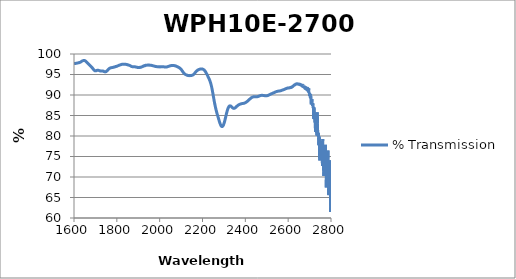
| Category | % Transmission |
|---|---|
| 1600.0 | 97.657 |
| 1601.0 | 97.665 |
| 1602.0 | 97.665 |
| 1603.0 | 97.666 |
| 1604.0 | 97.664 |
| 1605.0 | 97.682 |
| 1606.0 | 97.692 |
| 1607.0 | 97.693 |
| 1608.0 | 97.714 |
| 1609.0 | 97.718 |
| 1610.0 | 97.729 |
| 1611.0 | 97.745 |
| 1612.0 | 97.748 |
| 1613.0 | 97.765 |
| 1614.0 | 97.775 |
| 1615.0 | 97.781 |
| 1616.0 | 97.804 |
| 1617.0 | 97.8 |
| 1618.0 | 97.821 |
| 1619.0 | 97.83 |
| 1620.0 | 97.844 |
| 1621.0 | 97.852 |
| 1622.0 | 97.857 |
| 1623.0 | 97.887 |
| 1624.0 | 97.904 |
| 1625.0 | 97.9 |
| 1626.0 | 97.936 |
| 1627.0 | 97.942 |
| 1628.0 | 97.966 |
| 1629.0 | 97.985 |
| 1630.0 | 98.01 |
| 1631.0 | 98.044 |
| 1632.0 | 98.07 |
| 1633.0 | 98.096 |
| 1634.0 | 98.143 |
| 1635.0 | 98.167 |
| 1636.0 | 98.215 |
| 1637.0 | 98.243 |
| 1638.0 | 98.276 |
| 1639.0 | 98.309 |
| 1640.0 | 98.335 |
| 1641.0 | 98.355 |
| 1642.0 | 98.372 |
| 1643.0 | 98.387 |
| 1644.0 | 98.399 |
| 1645.0 | 98.411 |
| 1646.0 | 98.398 |
| 1647.0 | 98.421 |
| 1648.0 | 98.415 |
| 1649.0 | 98.405 |
| 1650.0 | 98.378 |
| 1651.0 | 98.365 |
| 1652.0 | 98.352 |
| 1653.0 | 98.299 |
| 1654.0 | 98.264 |
| 1655.0 | 98.22 |
| 1656.0 | 98.18 |
| 1657.0 | 98.124 |
| 1658.0 | 98.075 |
| 1659.0 | 98.01 |
| 1660.0 | 97.97 |
| 1661.0 | 97.896 |
| 1662.0 | 97.85 |
| 1663.0 | 97.784 |
| 1664.0 | 97.74 |
| 1665.0 | 97.688 |
| 1666.0 | 97.623 |
| 1667.0 | 97.603 |
| 1668.0 | 97.549 |
| 1669.0 | 97.497 |
| 1670.0 | 97.454 |
| 1671.0 | 97.395 |
| 1672.0 | 97.358 |
| 1673.0 | 97.299 |
| 1674.0 | 97.255 |
| 1675.0 | 97.188 |
| 1676.0 | 97.139 |
| 1677.0 | 97.084 |
| 1678.0 | 97.028 |
| 1679.0 | 96.959 |
| 1680.0 | 96.906 |
| 1681.0 | 96.863 |
| 1682.0 | 96.785 |
| 1683.0 | 96.753 |
| 1684.0 | 96.691 |
| 1685.0 | 96.601 |
| 1686.0 | 96.585 |
| 1687.0 | 96.518 |
| 1688.0 | 96.436 |
| 1689.0 | 96.383 |
| 1690.0 | 96.314 |
| 1691.0 | 96.241 |
| 1692.0 | 96.179 |
| 1693.0 | 96.11 |
| 1694.0 | 96.063 |
| 1695.0 | 96.016 |
| 1696.0 | 95.968 |
| 1697.0 | 95.936 |
| 1698.0 | 95.902 |
| 1699.0 | 95.906 |
| 1700.0 | 95.894 |
| 1701.0 | 95.901 |
| 1702.0 | 95.904 |
| 1703.0 | 95.925 |
| 1704.0 | 95.923 |
| 1705.0 | 95.965 |
| 1706.0 | 95.981 |
| 1707.0 | 95.998 |
| 1708.0 | 96.009 |
| 1709.0 | 96.031 |
| 1710.0 | 96.039 |
| 1711.0 | 96.037 |
| 1712.0 | 96.04 |
| 1713.0 | 96.033 |
| 1714.0 | 96.013 |
| 1715.0 | 96.004 |
| 1716.0 | 95.992 |
| 1717.0 | 95.968 |
| 1718.0 | 95.951 |
| 1719.0 | 95.929 |
| 1720.0 | 95.92 |
| 1721.0 | 95.905 |
| 1722.0 | 95.876 |
| 1723.0 | 95.88 |
| 1724.0 | 95.865 |
| 1725.0 | 95.863 |
| 1726.0 | 95.849 |
| 1727.0 | 95.869 |
| 1728.0 | 95.855 |
| 1729.0 | 95.851 |
| 1730.0 | 95.861 |
| 1731.0 | 95.872 |
| 1732.0 | 95.848 |
| 1733.0 | 95.855 |
| 1734.0 | 95.851 |
| 1735.0 | 95.824 |
| 1736.0 | 95.831 |
| 1737.0 | 95.787 |
| 1738.0 | 95.792 |
| 1739.0 | 95.744 |
| 1740.0 | 95.733 |
| 1741.0 | 95.713 |
| 1742.0 | 95.682 |
| 1743.0 | 95.68 |
| 1744.0 | 95.665 |
| 1745.0 | 95.637 |
| 1746.0 | 95.647 |
| 1747.0 | 95.646 |
| 1748.0 | 95.674 |
| 1749.0 | 95.686 |
| 1750.0 | 95.705 |
| 1751.0 | 95.746 |
| 1752.0 | 95.784 |
| 1753.0 | 95.831 |
| 1754.0 | 95.878 |
| 1755.0 | 95.925 |
| 1756.0 | 95.989 |
| 1757.0 | 96.049 |
| 1758.0 | 96.101 |
| 1759.0 | 96.159 |
| 1760.0 | 96.219 |
| 1761.0 | 96.257 |
| 1762.0 | 96.325 |
| 1763.0 | 96.36 |
| 1764.0 | 96.415 |
| 1765.0 | 96.465 |
| 1766.0 | 96.497 |
| 1767.0 | 96.523 |
| 1768.0 | 96.564 |
| 1769.0 | 96.571 |
| 1770.0 | 96.602 |
| 1771.0 | 96.623 |
| 1772.0 | 96.636 |
| 1773.0 | 96.648 |
| 1774.0 | 96.657 |
| 1775.0 | 96.671 |
| 1776.0 | 96.676 |
| 1777.0 | 96.688 |
| 1778.0 | 96.705 |
| 1779.0 | 96.702 |
| 1780.0 | 96.726 |
| 1781.0 | 96.737 |
| 1782.0 | 96.733 |
| 1783.0 | 96.746 |
| 1784.0 | 96.778 |
| 1785.0 | 96.769 |
| 1786.0 | 96.801 |
| 1787.0 | 96.808 |
| 1788.0 | 96.81 |
| 1789.0 | 96.827 |
| 1790.0 | 96.83 |
| 1791.0 | 96.877 |
| 1792.0 | 96.886 |
| 1793.0 | 96.899 |
| 1794.0 | 96.936 |
| 1795.0 | 96.927 |
| 1796.0 | 96.932 |
| 1797.0 | 96.95 |
| 1798.0 | 96.978 |
| 1799.0 | 96.994 |
| 1800.0 | 96.997 |
| 1801.0 | 97.032 |
| 1802.0 | 97.054 |
| 1803.0 | 97.079 |
| 1804.0 | 97.099 |
| 1805.0 | 97.122 |
| 1806.0 | 97.146 |
| 1807.0 | 97.161 |
| 1808.0 | 97.187 |
| 1809.0 | 97.211 |
| 1810.0 | 97.235 |
| 1811.0 | 97.259 |
| 1812.0 | 97.274 |
| 1813.0 | 97.302 |
| 1814.0 | 97.313 |
| 1815.0 | 97.331 |
| 1816.0 | 97.353 |
| 1817.0 | 97.37 |
| 1818.0 | 97.389 |
| 1819.0 | 97.403 |
| 1820.0 | 97.408 |
| 1821.0 | 97.44 |
| 1822.0 | 97.461 |
| 1823.0 | 97.471 |
| 1824.0 | 97.476 |
| 1825.0 | 97.494 |
| 1826.0 | 97.499 |
| 1827.0 | 97.513 |
| 1828.0 | 97.509 |
| 1829.0 | 97.52 |
| 1830.0 | 97.52 |
| 1831.0 | 97.527 |
| 1832.0 | 97.52 |
| 1833.0 | 97.52 |
| 1834.0 | 97.515 |
| 1835.0 | 97.508 |
| 1836.0 | 97.494 |
| 1837.0 | 97.494 |
| 1838.0 | 97.498 |
| 1839.0 | 97.487 |
| 1840.0 | 97.486 |
| 1841.0 | 97.48 |
| 1842.0 | 97.483 |
| 1843.0 | 97.462 |
| 1844.0 | 97.46 |
| 1845.0 | 97.442 |
| 1846.0 | 97.432 |
| 1847.0 | 97.426 |
| 1848.0 | 97.427 |
| 1849.0 | 97.375 |
| 1850.0 | 97.385 |
| 1851.0 | 97.37 |
| 1852.0 | 97.323 |
| 1853.0 | 97.351 |
| 1854.0 | 97.321 |
| 1855.0 | 97.304 |
| 1856.0 | 97.284 |
| 1857.0 | 97.258 |
| 1858.0 | 97.245 |
| 1859.0 | 97.224 |
| 1860.0 | 97.204 |
| 1861.0 | 97.177 |
| 1862.0 | 97.155 |
| 1863.0 | 97.125 |
| 1864.0 | 97.094 |
| 1865.0 | 97.066 |
| 1866.0 | 97.043 |
| 1867.0 | 97.008 |
| 1868.0 | 96.982 |
| 1869.0 | 96.959 |
| 1870.0 | 96.934 |
| 1871.0 | 96.919 |
| 1872.0 | 96.911 |
| 1873.0 | 96.912 |
| 1874.0 | 96.897 |
| 1875.0 | 96.899 |
| 1876.0 | 96.895 |
| 1877.0 | 96.895 |
| 1878.0 | 96.897 |
| 1879.0 | 96.905 |
| 1880.0 | 96.896 |
| 1881.0 | 96.896 |
| 1882.0 | 96.89 |
| 1883.0 | 96.88 |
| 1884.0 | 96.877 |
| 1885.0 | 96.881 |
| 1886.0 | 96.87 |
| 1887.0 | 96.848 |
| 1888.0 | 96.846 |
| 1889.0 | 96.833 |
| 1890.0 | 96.814 |
| 1891.0 | 96.803 |
| 1892.0 | 96.794 |
| 1893.0 | 96.775 |
| 1894.0 | 96.771 |
| 1895.0 | 96.756 |
| 1896.0 | 96.73 |
| 1897.0 | 96.728 |
| 1898.0 | 96.71 |
| 1899.0 | 96.705 |
| 1900.0 | 96.689 |
| 1901.0 | 96.684 |
| 1902.0 | 96.7 |
| 1903.0 | 96.691 |
| 1904.0 | 96.697 |
| 1905.0 | 96.685 |
| 1906.0 | 96.691 |
| 1907.0 | 96.708 |
| 1908.0 | 96.721 |
| 1909.0 | 96.782 |
| 1910.0 | 96.738 |
| 1911.0 | 96.745 |
| 1912.0 | 96.778 |
| 1913.0 | 96.788 |
| 1914.0 | 96.829 |
| 1915.0 | 96.804 |
| 1916.0 | 96.851 |
| 1917.0 | 96.879 |
| 1918.0 | 96.9 |
| 1919.0 | 96.916 |
| 1920.0 | 96.946 |
| 1921.0 | 96.972 |
| 1922.0 | 96.99 |
| 1923.0 | 97.044 |
| 1924.0 | 97.047 |
| 1925.0 | 97.035 |
| 1926.0 | 97.096 |
| 1927.0 | 97.131 |
| 1928.0 | 97.138 |
| 1929.0 | 97.155 |
| 1930.0 | 97.166 |
| 1931.0 | 97.126 |
| 1932.0 | 97.205 |
| 1933.0 | 97.242 |
| 1934.0 | 97.241 |
| 1935.0 | 97.235 |
| 1936.0 | 97.239 |
| 1937.0 | 97.247 |
| 1938.0 | 97.262 |
| 1939.0 | 97.259 |
| 1940.0 | 97.273 |
| 1941.0 | 97.28 |
| 1942.0 | 97.283 |
| 1943.0 | 97.284 |
| 1944.0 | 97.297 |
| 1945.0 | 97.288 |
| 1946.0 | 97.286 |
| 1947.0 | 97.295 |
| 1948.0 | 97.286 |
| 1949.0 | 97.302 |
| 1950.0 | 97.291 |
| 1951.0 | 97.292 |
| 1952.0 | 97.293 |
| 1953.0 | 97.277 |
| 1954.0 | 97.277 |
| 1955.0 | 97.266 |
| 1956.0 | 97.273 |
| 1957.0 | 97.256 |
| 1958.0 | 97.26 |
| 1959.0 | 97.249 |
| 1960.0 | 97.238 |
| 1961.0 | 97.232 |
| 1962.0 | 97.227 |
| 1963.0 | 97.203 |
| 1964.0 | 97.198 |
| 1965.0 | 97.182 |
| 1966.0 | 97.169 |
| 1967.0 | 97.149 |
| 1968.0 | 97.145 |
| 1969.0 | 97.131 |
| 1970.0 | 97.112 |
| 1971.0 | 97.1 |
| 1972.0 | 97.082 |
| 1973.0 | 97.07 |
| 1974.0 | 97.042 |
| 1975.0 | 97.04 |
| 1976.0 | 97.03 |
| 1977.0 | 97.011 |
| 1978.0 | 96.988 |
| 1979.0 | 96.994 |
| 1980.0 | 96.972 |
| 1981.0 | 96.959 |
| 1982.0 | 96.949 |
| 1983.0 | 96.94 |
| 1984.0 | 96.929 |
| 1985.0 | 96.924 |
| 1986.0 | 96.915 |
| 1987.0 | 96.914 |
| 1988.0 | 96.908 |
| 1989.0 | 96.897 |
| 1990.0 | 96.884 |
| 1991.0 | 96.876 |
| 1992.0 | 96.89 |
| 1993.0 | 96.867 |
| 1994.0 | 96.871 |
| 1995.0 | 96.855 |
| 1996.0 | 96.869 |
| 1997.0 | 96.864 |
| 1998.0 | 96.866 |
| 1999.0 | 96.852 |
| 2000.0 | 96.863 |
| 2001.0 | 96.862 |
| 2002.0 | 96.869 |
| 2003.0 | 96.859 |
| 2004.0 | 96.856 |
| 2005.0 | 96.875 |
| 2006.0 | 96.863 |
| 2007.0 | 96.869 |
| 2008.0 | 96.877 |
| 2009.0 | 96.882 |
| 2010.0 | 96.874 |
| 2011.0 | 96.895 |
| 2012.0 | 96.887 |
| 2013.0 | 96.882 |
| 2014.0 | 96.89 |
| 2015.0 | 96.888 |
| 2016.0 | 96.884 |
| 2017.0 | 96.89 |
| 2018.0 | 96.877 |
| 2019.0 | 96.88 |
| 2020.0 | 96.874 |
| 2021.0 | 96.861 |
| 2022.0 | 96.854 |
| 2023.0 | 96.857 |
| 2024.0 | 96.852 |
| 2025.0 | 96.841 |
| 2026.0 | 96.837 |
| 2027.0 | 96.834 |
| 2028.0 | 96.824 |
| 2029.0 | 96.845 |
| 2030.0 | 96.827 |
| 2031.0 | 96.837 |
| 2032.0 | 96.858 |
| 2033.0 | 96.839 |
| 2034.0 | 96.865 |
| 2035.0 | 96.876 |
| 2036.0 | 96.884 |
| 2037.0 | 96.9 |
| 2038.0 | 96.921 |
| 2039.0 | 96.938 |
| 2040.0 | 96.956 |
| 2041.0 | 96.972 |
| 2042.0 | 96.989 |
| 2043.0 | 97.006 |
| 2044.0 | 97.028 |
| 2045.0 | 97.053 |
| 2046.0 | 97.061 |
| 2047.0 | 97.088 |
| 2048.0 | 97.101 |
| 2049.0 | 97.123 |
| 2050.0 | 97.127 |
| 2051.0 | 97.136 |
| 2052.0 | 97.161 |
| 2053.0 | 97.162 |
| 2054.0 | 97.175 |
| 2055.0 | 97.178 |
| 2056.0 | 97.187 |
| 2057.0 | 97.189 |
| 2058.0 | 97.192 |
| 2059.0 | 97.194 |
| 2060.0 | 97.201 |
| 2061.0 | 97.199 |
| 2062.0 | 97.194 |
| 2063.0 | 97.187 |
| 2064.0 | 97.196 |
| 2065.0 | 97.174 |
| 2066.0 | 97.188 |
| 2067.0 | 97.179 |
| 2068.0 | 97.161 |
| 2069.0 | 97.147 |
| 2070.0 | 97.133 |
| 2071.0 | 97.14 |
| 2072.0 | 97.103 |
| 2073.0 | 97.113 |
| 2074.0 | 97.077 |
| 2075.0 | 97.083 |
| 2076.0 | 97.041 |
| 2077.0 | 97.048 |
| 2078.0 | 97.002 |
| 2079.0 | 96.993 |
| 2080.0 | 96.962 |
| 2081.0 | 96.937 |
| 2082.0 | 96.922 |
| 2083.0 | 96.89 |
| 2084.0 | 96.885 |
| 2085.0 | 96.83 |
| 2086.0 | 96.808 |
| 2087.0 | 96.795 |
| 2088.0 | 96.741 |
| 2089.0 | 96.727 |
| 2090.0 | 96.685 |
| 2091.0 | 96.668 |
| 2092.0 | 96.621 |
| 2093.0 | 96.594 |
| 2094.0 | 96.555 |
| 2095.0 | 96.521 |
| 2096.0 | 96.465 |
| 2097.0 | 96.427 |
| 2098.0 | 96.368 |
| 2099.0 | 96.306 |
| 2100.0 | 96.265 |
| 2101.0 | 96.201 |
| 2102.0 | 96.125 |
| 2103.0 | 96.061 |
| 2104.0 | 95.992 |
| 2105.0 | 95.911 |
| 2106.0 | 95.845 |
| 2107.0 | 95.754 |
| 2108.0 | 95.693 |
| 2109.0 | 95.592 |
| 2110.0 | 95.546 |
| 2111.0 | 95.467 |
| 2112.0 | 95.393 |
| 2113.0 | 95.333 |
| 2114.0 | 95.28 |
| 2115.0 | 95.22 |
| 2116.0 | 95.175 |
| 2117.0 | 95.129 |
| 2118.0 | 95.085 |
| 2119.0 | 95.048 |
| 2120.0 | 95.017 |
| 2121.0 | 94.989 |
| 2122.0 | 94.965 |
| 2123.0 | 94.938 |
| 2124.0 | 94.916 |
| 2125.0 | 94.884 |
| 2126.0 | 94.884 |
| 2127.0 | 94.839 |
| 2128.0 | 94.838 |
| 2129.0 | 94.805 |
| 2130.0 | 94.809 |
| 2131.0 | 94.774 |
| 2132.0 | 94.763 |
| 2133.0 | 94.761 |
| 2134.0 | 94.74 |
| 2135.0 | 94.746 |
| 2136.0 | 94.74 |
| 2137.0 | 94.724 |
| 2138.0 | 94.72 |
| 2139.0 | 94.736 |
| 2140.0 | 94.728 |
| 2141.0 | 94.738 |
| 2142.0 | 94.722 |
| 2143.0 | 94.73 |
| 2144.0 | 94.732 |
| 2145.0 | 94.739 |
| 2146.0 | 94.757 |
| 2147.0 | 94.75 |
| 2148.0 | 94.765 |
| 2149.0 | 94.774 |
| 2150.0 | 94.791 |
| 2151.0 | 94.808 |
| 2152.0 | 94.818 |
| 2153.0 | 94.837 |
| 2154.0 | 94.858 |
| 2155.0 | 94.889 |
| 2156.0 | 94.928 |
| 2157.0 | 94.96 |
| 2158.0 | 94.975 |
| 2159.0 | 95.045 |
| 2160.0 | 95.087 |
| 2161.0 | 95.16 |
| 2162.0 | 95.217 |
| 2163.0 | 95.279 |
| 2164.0 | 95.344 |
| 2165.0 | 95.405 |
| 2166.0 | 95.463 |
| 2167.0 | 95.53 |
| 2168.0 | 95.601 |
| 2169.0 | 95.668 |
| 2170.0 | 95.715 |
| 2171.0 | 95.77 |
| 2172.0 | 95.833 |
| 2173.0 | 95.881 |
| 2174.0 | 95.923 |
| 2175.0 | 95.978 |
| 2176.0 | 96.022 |
| 2177.0 | 96.054 |
| 2178.0 | 96.088 |
| 2179.0 | 96.12 |
| 2180.0 | 96.152 |
| 2181.0 | 96.172 |
| 2182.0 | 96.206 |
| 2183.0 | 96.224 |
| 2184.0 | 96.243 |
| 2185.0 | 96.258 |
| 2186.0 | 96.273 |
| 2187.0 | 96.289 |
| 2188.0 | 96.303 |
| 2189.0 | 96.315 |
| 2190.0 | 96.332 |
| 2191.0 | 96.347 |
| 2192.0 | 96.352 |
| 2193.0 | 96.353 |
| 2194.0 | 96.37 |
| 2195.0 | 96.354 |
| 2196.0 | 96.369 |
| 2197.0 | 96.36 |
| 2198.0 | 96.35 |
| 2199.0 | 96.337 |
| 2200.0 | 96.325 |
| 2201.0 | 96.309 |
| 2202.0 | 96.288 |
| 2203.0 | 96.261 |
| 2204.0 | 96.235 |
| 2205.0 | 96.198 |
| 2206.0 | 96.161 |
| 2207.0 | 96.124 |
| 2208.0 | 96.081 |
| 2209.0 | 96.009 |
| 2210.0 | 95.955 |
| 2211.0 | 95.896 |
| 2212.0 | 95.83 |
| 2213.0 | 95.756 |
| 2214.0 | 95.665 |
| 2215.0 | 95.593 |
| 2216.0 | 95.502 |
| 2217.0 | 95.406 |
| 2218.0 | 95.314 |
| 2219.0 | 95.211 |
| 2220.0 | 95.113 |
| 2221.0 | 95.003 |
| 2222.0 | 94.894 |
| 2223.0 | 94.791 |
| 2224.0 | 94.684 |
| 2225.0 | 94.58 |
| 2226.0 | 94.466 |
| 2227.0 | 94.357 |
| 2228.0 | 94.247 |
| 2229.0 | 94.137 |
| 2230.0 | 94.032 |
| 2231.0 | 93.917 |
| 2232.0 | 93.794 |
| 2233.0 | 93.671 |
| 2234.0 | 93.547 |
| 2235.0 | 93.399 |
| 2236.0 | 93.256 |
| 2237.0 | 93.096 |
| 2238.0 | 92.923 |
| 2239.0 | 92.733 |
| 2240.0 | 92.536 |
| 2241.0 | 92.331 |
| 2242.0 | 92.107 |
| 2243.0 | 91.878 |
| 2244.0 | 91.626 |
| 2245.0 | 91.357 |
| 2246.0 | 91.091 |
| 2247.0 | 90.807 |
| 2248.0 | 90.519 |
| 2249.0 | 90.231 |
| 2250.0 | 89.932 |
| 2251.0 | 89.623 |
| 2252.0 | 89.32 |
| 2253.0 | 89.025 |
| 2254.0 | 88.722 |
| 2255.0 | 88.453 |
| 2256.0 | 88.167 |
| 2257.0 | 87.892 |
| 2258.0 | 87.636 |
| 2259.0 | 87.379 |
| 2260.0 | 87.138 |
| 2261.0 | 86.89 |
| 2262.0 | 86.678 |
| 2263.0 | 86.458 |
| 2264.0 | 86.237 |
| 2265.0 | 86.041 |
| 2266.0 | 85.847 |
| 2267.0 | 85.645 |
| 2268.0 | 85.462 |
| 2269.0 | 85.277 |
| 2270.0 | 85.102 |
| 2271.0 | 84.918 |
| 2272.0 | 84.746 |
| 2273.0 | 84.565 |
| 2274.0 | 84.394 |
| 2275.0 | 84.214 |
| 2276.0 | 84.037 |
| 2277.0 | 83.867 |
| 2278.0 | 83.689 |
| 2279.0 | 83.52 |
| 2280.0 | 83.36 |
| 2281.0 | 83.213 |
| 2282.0 | 83.059 |
| 2283.0 | 82.907 |
| 2284.0 | 82.786 |
| 2285.0 | 82.667 |
| 2286.0 | 82.566 |
| 2287.0 | 82.477 |
| 2288.0 | 82.403 |
| 2289.0 | 82.35 |
| 2290.0 | 82.316 |
| 2291.0 | 82.307 |
| 2292.0 | 82.304 |
| 2293.0 | 82.327 |
| 2294.0 | 82.374 |
| 2295.0 | 82.44 |
| 2296.0 | 82.511 |
| 2297.0 | 82.611 |
| 2298.0 | 82.729 |
| 2299.0 | 82.865 |
| 2300.0 | 83.002 |
| 2301.0 | 83.168 |
| 2302.0 | 83.346 |
| 2303.0 | 83.521 |
| 2304.0 | 83.721 |
| 2305.0 | 83.922 |
| 2306.0 | 84.14 |
| 2307.0 | 84.36 |
| 2308.0 | 84.58 |
| 2309.0 | 84.804 |
| 2310.0 | 85.033 |
| 2311.0 | 85.247 |
| 2312.0 | 85.464 |
| 2313.0 | 85.669 |
| 2314.0 | 85.867 |
| 2315.0 | 86.07 |
| 2316.0 | 86.243 |
| 2317.0 | 86.424 |
| 2318.0 | 86.563 |
| 2319.0 | 86.704 |
| 2320.0 | 86.842 |
| 2321.0 | 86.947 |
| 2322.0 | 87.065 |
| 2323.0 | 87.131 |
| 2324.0 | 87.222 |
| 2325.0 | 87.265 |
| 2326.0 | 87.322 |
| 2327.0 | 87.336 |
| 2328.0 | 87.348 |
| 2329.0 | 87.351 |
| 2330.0 | 87.344 |
| 2331.0 | 87.324 |
| 2332.0 | 87.296 |
| 2333.0 | 87.262 |
| 2334.0 | 87.214 |
| 2335.0 | 87.168 |
| 2336.0 | 87.122 |
| 2337.0 | 87.069 |
| 2338.0 | 87.018 |
| 2339.0 | 86.965 |
| 2340.0 | 86.905 |
| 2341.0 | 86.869 |
| 2342.0 | 86.836 |
| 2343.0 | 86.784 |
| 2344.0 | 86.783 |
| 2345.0 | 86.767 |
| 2346.0 | 86.736 |
| 2347.0 | 86.738 |
| 2348.0 | 86.756 |
| 2349.0 | 86.769 |
| 2350.0 | 86.779 |
| 2351.0 | 86.814 |
| 2352.0 | 86.839 |
| 2353.0 | 86.88 |
| 2354.0 | 86.923 |
| 2355.0 | 86.977 |
| 2356.0 | 87.012 |
| 2357.0 | 87.074 |
| 2358.0 | 87.131 |
| 2359.0 | 87.183 |
| 2360.0 | 87.224 |
| 2361.0 | 87.285 |
| 2362.0 | 87.328 |
| 2363.0 | 87.375 |
| 2364.0 | 87.415 |
| 2365.0 | 87.462 |
| 2366.0 | 87.506 |
| 2367.0 | 87.535 |
| 2368.0 | 87.57 |
| 2369.0 | 87.603 |
| 2370.0 | 87.634 |
| 2371.0 | 87.663 |
| 2372.0 | 87.685 |
| 2373.0 | 87.718 |
| 2374.0 | 87.734 |
| 2375.0 | 87.76 |
| 2376.0 | 87.778 |
| 2377.0 | 87.793 |
| 2378.0 | 87.812 |
| 2379.0 | 87.834 |
| 2380.0 | 87.849 |
| 2381.0 | 87.862 |
| 2382.0 | 87.872 |
| 2383.0 | 87.889 |
| 2384.0 | 87.897 |
| 2385.0 | 87.91 |
| 2386.0 | 87.919 |
| 2387.0 | 87.913 |
| 2388.0 | 87.925 |
| 2389.0 | 87.939 |
| 2390.0 | 87.943 |
| 2391.0 | 87.957 |
| 2392.0 | 87.968 |
| 2393.0 | 87.975 |
| 2394.0 | 87.988 |
| 2395.0 | 88.006 |
| 2396.0 | 88.026 |
| 2397.0 | 88.049 |
| 2398.0 | 88.06 |
| 2399.0 | 88.092 |
| 2400.0 | 88.119 |
| 2401.0 | 88.154 |
| 2402.0 | 88.191 |
| 2403.0 | 88.215 |
| 2404.0 | 88.246 |
| 2405.0 | 88.29 |
| 2406.0 | 88.325 |
| 2407.0 | 88.362 |
| 2408.0 | 88.4 |
| 2409.0 | 88.446 |
| 2410.0 | 88.49 |
| 2411.0 | 88.528 |
| 2412.0 | 88.578 |
| 2413.0 | 88.621 |
| 2414.0 | 88.664 |
| 2415.0 | 88.713 |
| 2416.0 | 88.767 |
| 2417.0 | 88.817 |
| 2418.0 | 88.869 |
| 2419.0 | 88.913 |
| 2420.0 | 88.971 |
| 2421.0 | 89.009 |
| 2422.0 | 89.055 |
| 2423.0 | 89.102 |
| 2424.0 | 89.149 |
| 2425.0 | 89.191 |
| 2426.0 | 89.233 |
| 2427.0 | 89.282 |
| 2428.0 | 89.323 |
| 2429.0 | 89.354 |
| 2430.0 | 89.387 |
| 2431.0 | 89.416 |
| 2432.0 | 89.445 |
| 2433.0 | 89.474 |
| 2434.0 | 89.491 |
| 2435.0 | 89.509 |
| 2436.0 | 89.523 |
| 2437.0 | 89.541 |
| 2438.0 | 89.553 |
| 2439.0 | 89.55 |
| 2440.0 | 89.556 |
| 2441.0 | 89.563 |
| 2442.0 | 89.558 |
| 2443.0 | 89.559 |
| 2444.0 | 89.555 |
| 2445.0 | 89.552 |
| 2446.0 | 89.553 |
| 2447.0 | 89.551 |
| 2448.0 | 89.55 |
| 2449.0 | 89.545 |
| 2450.0 | 89.551 |
| 2451.0 | 89.545 |
| 2452.0 | 89.559 |
| 2453.0 | 89.558 |
| 2454.0 | 89.573 |
| 2455.0 | 89.578 |
| 2456.0 | 89.581 |
| 2457.0 | 89.6 |
| 2458.0 | 89.617 |
| 2459.0 | 89.627 |
| 2460.0 | 89.646 |
| 2461.0 | 89.667 |
| 2462.0 | 89.694 |
| 2463.0 | 89.715 |
| 2464.0 | 89.726 |
| 2465.0 | 89.744 |
| 2466.0 | 89.778 |
| 2467.0 | 89.792 |
| 2468.0 | 89.816 |
| 2469.0 | 89.829 |
| 2470.0 | 89.853 |
| 2471.0 | 89.855 |
| 2472.0 | 89.877 |
| 2473.0 | 89.889 |
| 2474.0 | 89.9 |
| 2475.0 | 89.904 |
| 2476.0 | 89.912 |
| 2477.0 | 89.911 |
| 2478.0 | 89.92 |
| 2479.0 | 89.916 |
| 2480.0 | 89.913 |
| 2481.0 | 89.908 |
| 2482.0 | 89.908 |
| 2483.0 | 89.896 |
| 2484.0 | 89.887 |
| 2485.0 | 89.884 |
| 2486.0 | 89.877 |
| 2487.0 | 89.863 |
| 2488.0 | 89.855 |
| 2489.0 | 89.845 |
| 2490.0 | 89.836 |
| 2491.0 | 89.825 |
| 2492.0 | 89.823 |
| 2493.0 | 89.814 |
| 2494.0 | 89.81 |
| 2495.0 | 89.804 |
| 2496.0 | 89.804 |
| 2497.0 | 89.804 |
| 2498.0 | 89.808 |
| 2499.0 | 89.805 |
| 2500.0 | 89.816 |
| 2501.0 | 89.824 |
| 2502.0 | 89.835 |
| 2503.0 | 89.851 |
| 2504.0 | 89.868 |
| 2505.0 | 89.882 |
| 2506.0 | 89.903 |
| 2507.0 | 89.921 |
| 2508.0 | 89.947 |
| 2509.0 | 89.968 |
| 2510.0 | 89.99 |
| 2511.0 | 90.016 |
| 2512.0 | 90.048 |
| 2513.0 | 90.066 |
| 2514.0 | 90.095 |
| 2515.0 | 90.123 |
| 2516.0 | 90.141 |
| 2517.0 | 90.172 |
| 2518.0 | 90.204 |
| 2519.0 | 90.227 |
| 2520.0 | 90.257 |
| 2521.0 | 90.277 |
| 2522.0 | 90.304 |
| 2523.0 | 90.334 |
| 2524.0 | 90.347 |
| 2525.0 | 90.368 |
| 2526.0 | 90.392 |
| 2527.0 | 90.413 |
| 2528.0 | 90.44 |
| 2529.0 | 90.472 |
| 2530.0 | 90.487 |
| 2531.0 | 90.512 |
| 2532.0 | 90.531 |
| 2533.0 | 90.557 |
| 2534.0 | 90.576 |
| 2535.0 | 90.602 |
| 2536.0 | 90.621 |
| 2537.0 | 90.651 |
| 2538.0 | 90.676 |
| 2539.0 | 90.693 |
| 2540.0 | 90.73 |
| 2541.0 | 90.75 |
| 2542.0 | 90.766 |
| 2543.0 | 90.789 |
| 2544.0 | 90.809 |
| 2545.0 | 90.827 |
| 2546.0 | 90.844 |
| 2547.0 | 90.86 |
| 2548.0 | 90.866 |
| 2549.0 | 90.888 |
| 2550.0 | 90.898 |
| 2551.0 | 90.907 |
| 2552.0 | 90.912 |
| 2553.0 | 90.936 |
| 2554.0 | 90.939 |
| 2555.0 | 90.955 |
| 2556.0 | 90.963 |
| 2557.0 | 90.974 |
| 2558.0 | 90.978 |
| 2559.0 | 90.988 |
| 2560.0 | 90.979 |
| 2561.0 | 90.993 |
| 2562.0 | 91.004 |
| 2563.0 | 91.018 |
| 2564.0 | 91.03 |
| 2565.0 | 91.047 |
| 2566.0 | 91.061 |
| 2567.0 | 91.08 |
| 2568.0 | 91.101 |
| 2569.0 | 91.109 |
| 2570.0 | 91.126 |
| 2571.0 | 91.157 |
| 2572.0 | 91.171 |
| 2573.0 | 91.19 |
| 2574.0 | 91.22 |
| 2575.0 | 91.233 |
| 2576.0 | 91.249 |
| 2577.0 | 91.262 |
| 2578.0 | 91.286 |
| 2579.0 | 91.304 |
| 2580.0 | 91.317 |
| 2581.0 | 91.341 |
| 2582.0 | 91.361 |
| 2583.0 | 91.396 |
| 2584.0 | 91.41 |
| 2585.0 | 91.444 |
| 2586.0 | 91.467 |
| 2587.0 | 91.476 |
| 2588.0 | 91.508 |
| 2589.0 | 91.536 |
| 2590.0 | 91.567 |
| 2591.0 | 91.578 |
| 2592.0 | 91.601 |
| 2593.0 | 91.627 |
| 2594.0 | 91.64 |
| 2595.0 | 91.646 |
| 2596.0 | 91.683 |
| 2597.0 | 91.687 |
| 2598.0 | 91.702 |
| 2599.0 | 91.71 |
| 2600.0 | 91.702 |
| 2601.0 | 91.718 |
| 2602.0 | 91.707 |
| 2603.0 | 91.723 |
| 2604.0 | 91.725 |
| 2605.0 | 91.756 |
| 2606.0 | 91.768 |
| 2607.0 | 91.751 |
| 2608.0 | 91.765 |
| 2609.0 | 91.805 |
| 2610.0 | 91.793 |
| 2611.0 | 91.806 |
| 2612.0 | 91.839 |
| 2613.0 | 91.811 |
| 2614.0 | 91.895 |
| 2615.0 | 91.866 |
| 2616.0 | 91.884 |
| 2617.0 | 91.954 |
| 2618.0 | 91.939 |
| 2619.0 | 91.973 |
| 2620.0 | 92.038 |
| 2621.0 | 92.07 |
| 2622.0 | 92.15 |
| 2623.0 | 92.169 |
| 2624.0 | 92.219 |
| 2625.0 | 92.27 |
| 2626.0 | 92.331 |
| 2627.0 | 92.373 |
| 2628.0 | 92.387 |
| 2629.0 | 92.444 |
| 2630.0 | 92.47 |
| 2631.0 | 92.452 |
| 2632.0 | 92.504 |
| 2633.0 | 92.563 |
| 2634.0 | 92.622 |
| 2635.0 | 92.612 |
| 2636.0 | 92.613 |
| 2637.0 | 92.655 |
| 2638.0 | 92.704 |
| 2639.0 | 92.683 |
| 2640.0 | 92.696 |
| 2641.0 | 92.749 |
| 2642.0 | 92.706 |
| 2643.0 | 92.7 |
| 2644.0 | 92.687 |
| 2645.0 | 92.7 |
| 2646.0 | 92.698 |
| 2647.0 | 92.621 |
| 2648.0 | 92.702 |
| 2649.0 | 92.696 |
| 2650.0 | 92.695 |
| 2651.0 | 92.637 |
| 2652.0 | 92.573 |
| 2653.0 | 92.569 |
| 2654.0 | 92.592 |
| 2655.0 | 92.568 |
| 2656.0 | 92.593 |
| 2657.0 | 92.505 |
| 2658.0 | 92.443 |
| 2659.0 | 92.539 |
| 2660.0 | 92.469 |
| 2661.0 | 92.351 |
| 2662.0 | 92.326 |
| 2663.0 | 92.364 |
| 2664.0 | 92.359 |
| 2665.0 | 92.253 |
| 2666.0 | 92.164 |
| 2667.0 | 92.109 |
| 2668.0 | 92.386 |
| 2669.0 | 92.309 |
| 2670.0 | 92.139 |
| 2671.0 | 92.027 |
| 2672.0 | 92.219 |
| 2673.0 | 92.13 |
| 2674.0 | 92.028 |
| 2675.0 | 92.271 |
| 2676.0 | 91.863 |
| 2677.0 | 91.805 |
| 2678.0 | 91.65 |
| 2679.0 | 92.026 |
| 2680.0 | 91.644 |
| 2681.0 | 91.597 |
| 2682.0 | 91.551 |
| 2683.0 | 91.807 |
| 2684.0 | 91.476 |
| 2685.0 | 91.455 |
| 2686.0 | 91.534 |
| 2687.0 | 91.276 |
| 2688.0 | 91.361 |
| 2689.0 | 91.633 |
| 2690.0 | 91.644 |
| 2691.0 | 91.642 |
| 2692.0 | 91.607 |
| 2693.0 | 91.322 |
| 2694.0 | 90.92 |
| 2695.0 | 90.886 |
| 2696.0 | 91.613 |
| 2697.0 | 90.432 |
| 2698.0 | 90.549 |
| 2699.0 | 90.474 |
| 2700.0 | 89.773 |
| 2701.0 | 90.316 |
| 2702.0 | 89.885 |
| 2703.0 | 89.457 |
| 2704.0 | 89.557 |
| 2705.0 | 89.934 |
| 2706.0 | 89.759 |
| 2707.0 | 88.321 |
| 2708.0 | 87.706 |
| 2709.0 | 89.014 |
| 2710.0 | 88.413 |
| 2711.0 | 89.011 |
| 2712.0 | 88.138 |
| 2713.0 | 87.593 |
| 2714.0 | 87.39 |
| 2715.0 | 88.019 |
| 2716.0 | 87.514 |
| 2717.0 | 86.8 |
| 2718.0 | 87.1 |
| 2719.0 | 84.12 |
| 2720.0 | 86.221 |
| 2721.0 | 86.998 |
| 2722.0 | 85.579 |
| 2723.0 | 85.87 |
| 2724.0 | 85.716 |
| 2725.0 | 83.292 |
| 2726.0 | 84.579 |
| 2727.0 | 81.966 |
| 2728.0 | 80.975 |
| 2729.0 | 83.464 |
| 2730.0 | 82.155 |
| 2731.0 | 82.293 |
| 2732.0 | 80.744 |
| 2733.0 | 81.145 |
| 2734.0 | 80.112 |
| 2735.0 | 81.233 |
| 2736.0 | 85.794 |
| 2737.0 | 83.018 |
| 2738.0 | 80.21 |
| 2739.0 | 80.476 |
| 2740.0 | 79.947 |
| 2741.0 | 80.782 |
| 2742.0 | 79.646 |
| 2743.0 | 77.759 |
| 2744.0 | 79.927 |
| 2745.0 | 78.13 |
| 2746.0 | 79.62 |
| 2747.0 | 74.048 |
| 2748.0 | 76.699 |
| 2749.0 | 77.469 |
| 2750.0 | 76.978 |
| 2751.0 | 77.252 |
| 2752.0 | 74.485 |
| 2753.0 | 74.68 |
| 2754.0 | 75.822 |
| 2755.0 | 75.473 |
| 2756.0 | 77.496 |
| 2757.0 | 74.849 |
| 2758.0 | 75.185 |
| 2759.0 | 75.21 |
| 2760.0 | 72.69 |
| 2761.0 | 79.261 |
| 2762.0 | 75.773 |
| 2763.0 | 73.176 |
| 2764.0 | 74.484 |
| 2765.0 | 73.379 |
| 2766.0 | 70.252 |
| 2767.0 | 71.43 |
| 2768.0 | 71.508 |
| 2769.0 | 71.983 |
| 2770.0 | 76.295 |
| 2771.0 | 76.374 |
| 2772.0 | 72.476 |
| 2773.0 | 70.238 |
| 2774.0 | 77.855 |
| 2775.0 | 72.711 |
| 2776.0 | 71.892 |
| 2777.0 | 71.581 |
| 2778.0 | 67.462 |
| 2779.0 | 71.77 |
| 2780.0 | 72.261 |
| 2781.0 | 75.296 |
| 2782.0 | 73.835 |
| 2783.0 | 73.853 |
| 2784.0 | 70.091 |
| 2785.0 | 73.292 |
| 2786.0 | 76.439 |
| 2787.0 | 69.185 |
| 2788.0 | 67.137 |
| 2789.0 | 65.579 |
| 2790.0 | 70.932 |
| 2791.0 | 71.386 |
| 2792.0 | 67.369 |
| 2793.0 | 68.359 |
| 2794.0 | 74.093 |
| 2795.0 | 67.029 |
| 2796.0 | 68.945 |
| 2797.0 | 73.751 |
| 2798.0 | 61.455 |
| 2799.0 | 65.696 |
| 2800.0 | 65.482 |